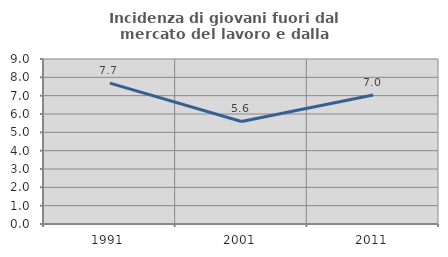
| Category | Incidenza di giovani fuori dal mercato del lavoro e dalla formazione  |
|---|---|
| 1991.0 | 7.684 |
| 2001.0 | 5.593 |
| 2011.0 | 7.033 |